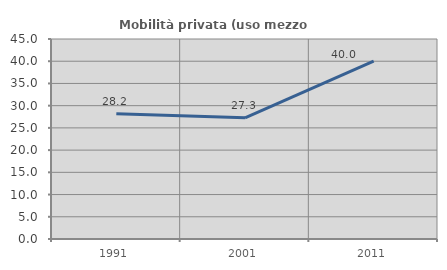
| Category | Mobilità privata (uso mezzo privato) |
|---|---|
| 1991.0 | 28.205 |
| 2001.0 | 27.273 |
| 2011.0 | 40 |